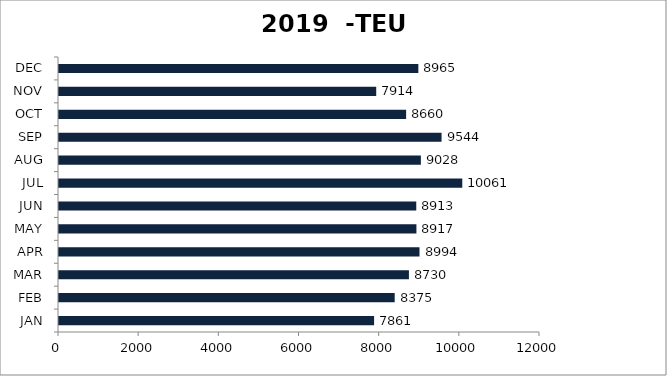
| Category | TEU |
|---|---|
| JAN | 7861 |
| FEB | 8375 |
| MAR | 8730 |
| APR | 8994 |
| MAY | 8917 |
| JUN | 8913 |
| JUL | 10061 |
| AUG | 9028 |
| SEP | 9544 |
| OCT | 8660 |
| NOV | 7914 |
| DEC | 8965 |